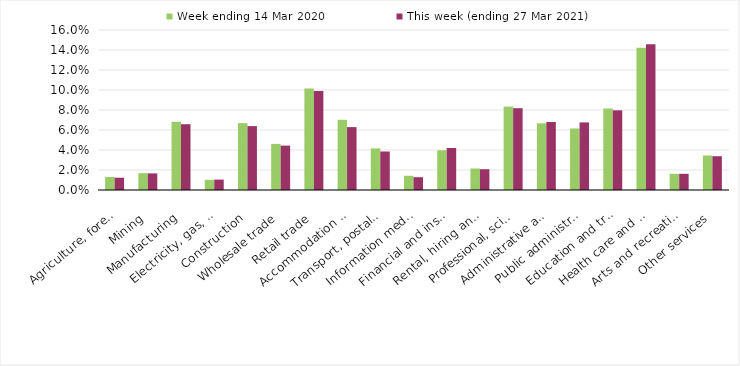
| Category | Week ending 14 Mar 2020 | This week (ending 27 Mar 2021) |
|---|---|---|
| Agriculture, forestry and fishing | 0.013 | 0.012 |
| Mining | 0.017 | 0.017 |
| Manufacturing | 0.068 | 0.066 |
| Electricity, gas, water and waste services | 0.01 | 0.01 |
| Construction | 0.067 | 0.064 |
| Wholesale trade | 0.046 | 0.044 |
| Retail trade | 0.102 | 0.099 |
| Accommodation and food services | 0.07 | 0.063 |
| Transport, postal and warehousing | 0.042 | 0.038 |
| Information media and telecommunications | 0.014 | 0.013 |
| Financial and insurance services | 0.04 | 0.042 |
| Rental, hiring and real estate services | 0.022 | 0.021 |
| Professional, scientific and technical services | 0.083 | 0.082 |
| Administrative and support services | 0.067 | 0.068 |
| Public administration and safety | 0.062 | 0.068 |
| Education and training | 0.082 | 0.08 |
| Health care and social assistance | 0.142 | 0.146 |
| Arts and recreation services | 0.016 | 0.016 |
| Other services | 0.034 | 0.034 |